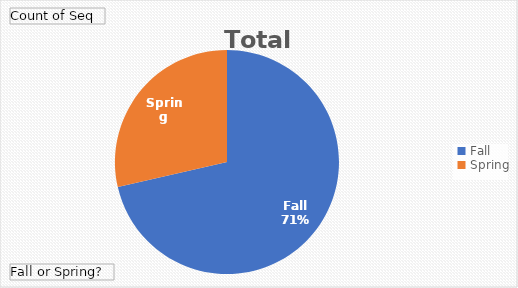
| Category | Total |
|---|---|
| Fall | 5 |
| Spring | 2 |